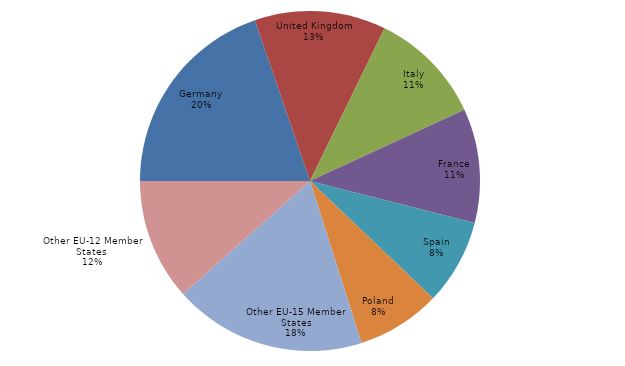
| Category | share of total |
|---|---|
| Germany | 0.197 |
| United Kingdom | 0.125 |
| Italy | 0.109 |
| France | 0.109 |
| Spain | 0.081 |
| Poland | 0.08 |
| Other EU-15 Member States | 0.183 |
| Other EU-12 Member States  | 0.116 |